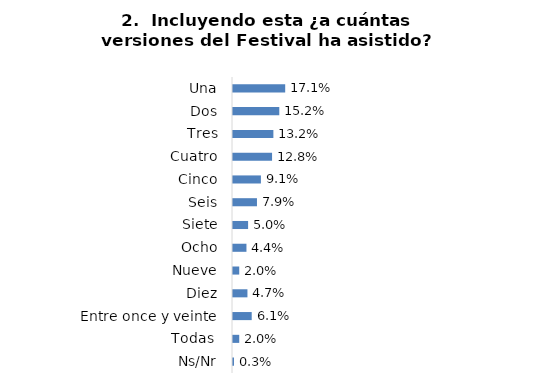
| Category | Series 0 |
|---|---|
| Una | 0.171 |
| Dos | 0.152 |
| Tres | 0.132 |
| Cuatro | 0.128 |
| Cinco | 0.091 |
| Seis | 0.079 |
| Siete | 0.05 |
| Ocho | 0.044 |
| Nueve | 0.02 |
| Diez | 0.047 |
| Entre once y veinte | 0.061 |
| Todas  | 0.02 |
| Ns/Nr | 0.003 |